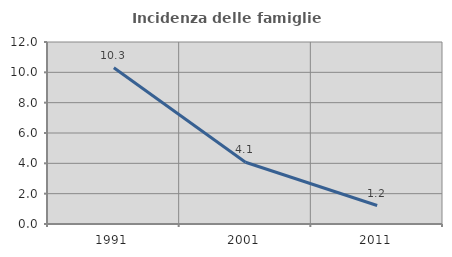
| Category | Incidenza delle famiglie numerose |
|---|---|
| 1991.0 | 10.299 |
| 2001.0 | 4.07 |
| 2011.0 | 1.22 |